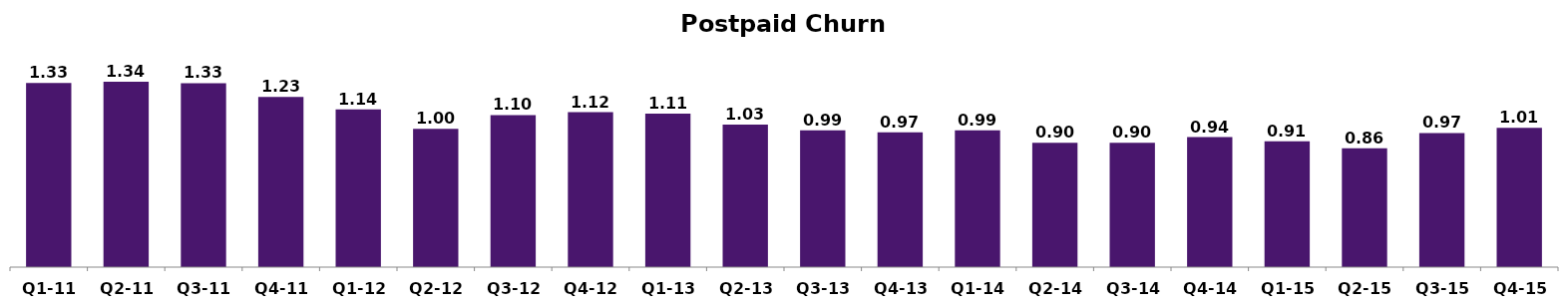
| Category | Series 0 |
|---|---|
| Q1-11 | 1.331 |
| Q2-11 | 1.34 |
| Q3-11 | 1.33 |
| Q4-11 | 1.23 |
| Q1-12 | 1.14 |
| Q2-12 | 1 |
| Q3-12 | 1.1 |
| Q4-12 | 1.12 |
| Q1-13 | 1.11 |
| Q2-13 | 1.03 |
| Q3-13 | 0.99 |
| Q4-13 | 0.974 |
| Q1-14 | 0.99 |
| Q2-14 | 0.9 |
| Q3-14 | 0.9 |
| Q4-14 | 0.94 |
| Q1-15 | 0.91 |
| Q2-15 | 0.86 |
| Q3-15 | 0.97 |
| Q4-15 | 1.008 |